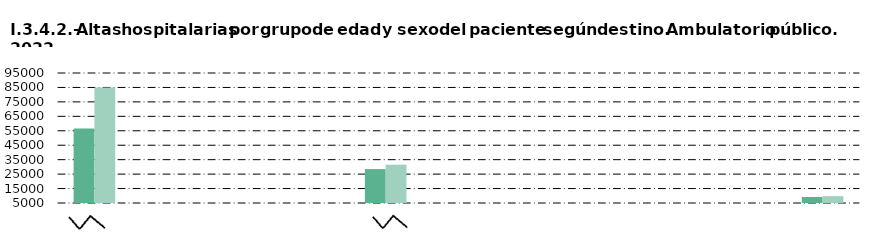
| Category |     Hombre |     Mujer |
|---|---|---|
| Alta médica | 56612 | 85001 |
| Alta voluntaria | 60 | 116 |
| Fallecimiento | 15 | 13 |
| Centro sociosanitario | 1 | 0 |
| Consulta hospitalaria | 28472 | 31524 |
| Urgencias | 18 | 21 |
| Cirugía ambulatoria | 253 | 431 |
| Atención primaria | 68 | 39 |
| Otro hospital | 416 | 537 |
| Continuación de tratamiento | 4505 | 2689 |
| No consta | 9155 | 9734 |